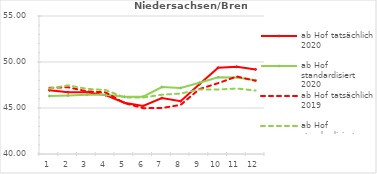
| Category | ab Hof tatsächlich 2020 | ab Hof standardisiert 2020 | ab Hof tatsächlich 2019 | ab Hof standardisiert 2019 |
|---|---|---|---|---|
| 0 | 46.94 | 46.301 | 47.187 | 47.115 |
| 1 | 46.715 | 46.352 | 47.256 | 47.466 |
| 2 | 46.717 | 46.434 | 46.812 | 47.081 |
| 3 | 46.402 | 46.436 | 46.696 | 46.955 |
| 4 | 45.573 | 46.218 | 45.538 | 46.148 |
| 5 | 45.217 | 46.23 | 44.984 | 46.139 |
| 6 | 46.076 | 47.283 | 44.997 | 46.446 |
| 7 | 45.74 | 47.181 | 45.337 | 46.568 |
| 8 | 47.579 | 47.745 | 47.053 | 47.016 |
| 9 | 49.381 | 48.34 | 47.701 | 47.009 |
| 10 | 49.478 | 48.327 | 48.425 | 47.121 |
| 11 | 49.191 | 48.028 | 47.959 | 46.898 |